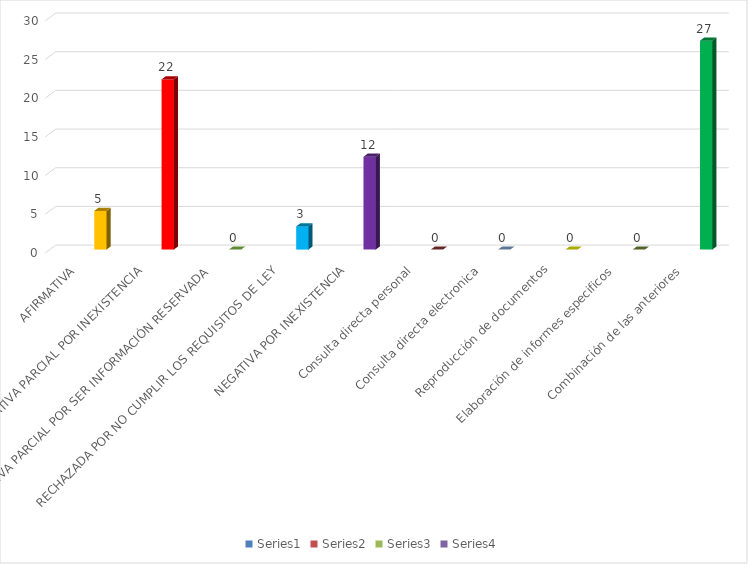
| Category | Series 0 | Series 1 | Series 2 | Series 3 |
|---|---|---|---|---|
| AFIRMATIVA |  |  |  | 5 |
| AFIRMATIVA PARCIAL POR INEXISTENCIA |  |  |  | 22 |
| AFIRMATIVA PARCIAL POR SER INFORMACIÓN RESERVADA |  |  |  | 0 |
| RECHAZADA POR NO CUMPLIR LOS REQUISITOS DE LEY |  |  |  | 3 |
| NEGATIVA POR INEXISTENCIA |  |  |  | 12 |
| Consulta directa personal |  |  |  | 0 |
| Consulta directa electronica |  |  |  | 0 |
| Reproducción de documentos |  |  |  | 0 |
| Elaboración de informes especificos |  |  |  | 0 |
| Combinación de las anteriores |  |  |  | 27 |